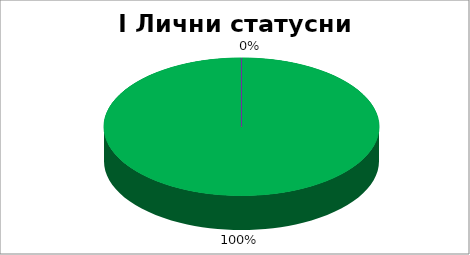
| Category | I Лични статусни положај |
|---|---|
| 0 | 1 |
| 1 | 0 |
| 2 | 0 |
| 3 | 0 |
| 4 | 0 |